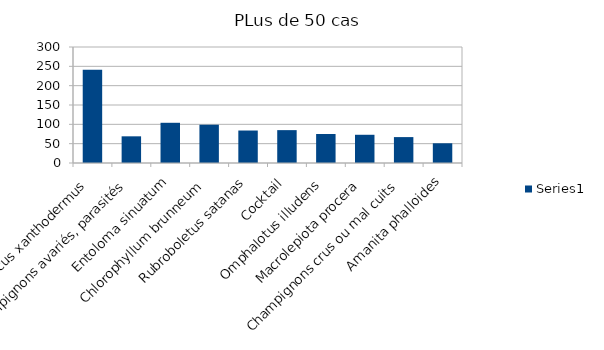
| Category | Series 0 |
|---|---|
| Agaricus xanthodermus | 241 |
| Champignons avariés, parasités | 69 |
| Entoloma sinuatum | 104 |
| Chlorophyllum brunneum | 99 |
| Rubroboletus satanas | 84 |
| Cocktail | 85 |
| Omphalotus illudens | 75 |
| Macrolepiota procera | 73 |
| Champignons crus ou mal cuits | 67 |
| Amanita phalloides | 51 |